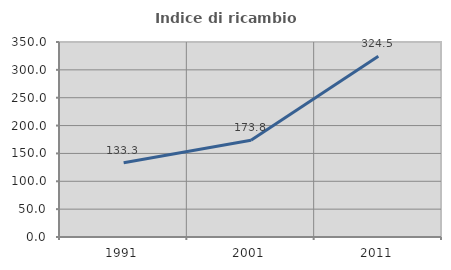
| Category | Indice di ricambio occupazionale  |
|---|---|
| 1991.0 | 133.333 |
| 2001.0 | 173.77 |
| 2011.0 | 324.528 |